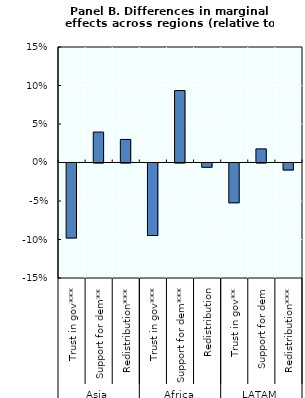
| Category | Series 0 |
|---|---|
| 0 | -0.097 |
| 1 | 0.04 |
| 2 | 0.03 |
| 3 | -0.094 |
| 4 | 0.093 |
| 5 | -0.006 |
| 6 | -0.052 |
| 7 | 0.018 |
| 8 | -0.009 |